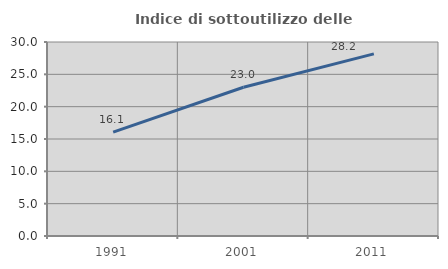
| Category | Indice di sottoutilizzo delle abitazioni  |
|---|---|
| 1991.0 | 16.06 |
| 2001.0 | 23.007 |
| 2011.0 | 28.168 |